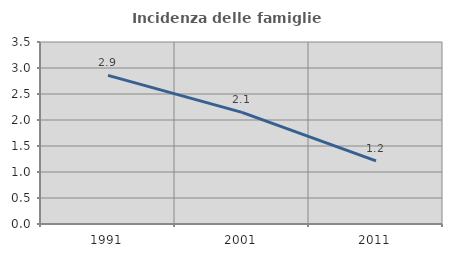
| Category | Incidenza delle famiglie numerose |
|---|---|
| 1991.0 | 2.857 |
| 2001.0 | 2.146 |
| 2011.0 | 1.215 |